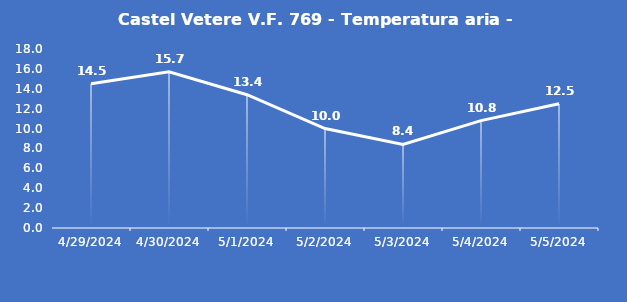
| Category | Castel Vetere V.F. 769 - Temperatura aria - Grezzo (°C) |
|---|---|
| 4/29/24 | 14.5 |
| 4/30/24 | 15.7 |
| 5/1/24 | 13.4 |
| 5/2/24 | 10 |
| 5/3/24 | 8.4 |
| 5/4/24 | 10.8 |
| 5/5/24 | 12.5 |